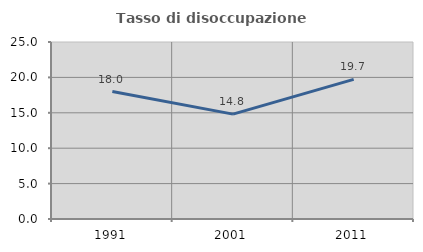
| Category | Tasso di disoccupazione giovanile  |
|---|---|
| 1991.0 | 18 |
| 2001.0 | 14.815 |
| 2011.0 | 19.718 |